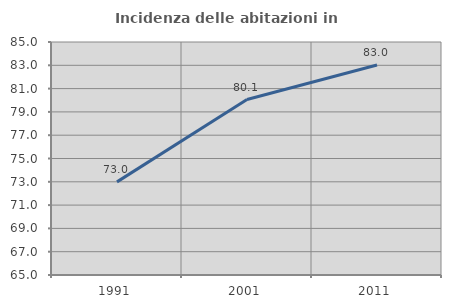
| Category | Incidenza delle abitazioni in proprietà  |
|---|---|
| 1991.0 | 72.993 |
| 2001.0 | 80.064 |
| 2011.0 | 83.029 |